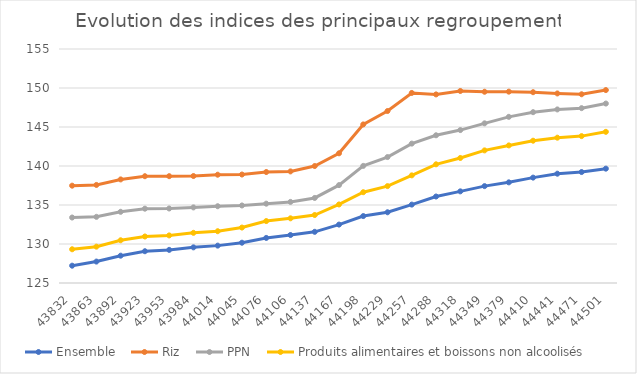
| Category | Ensemble | Riz | PPN | Produits alimentaires et boissons non alcoolisés |
|---|---|---|---|---|
| 43832.0 | 127.22 | 137.477 | 133.394 | 129.324 |
| 43863.0 | 127.747 | 137.571 | 133.482 | 129.658 |
| 43892.0 | 128.503 | 138.279 | 134.127 | 130.477 |
| 43923.0 | 129.073 | 138.691 | 134.528 | 130.962 |
| 43953.0 | 129.246 | 138.695 | 134.553 | 131.1 |
| 43984.0 | 129.569 | 138.715 | 134.691 | 131.433 |
| 44014.0 | 129.792 | 138.884 | 134.842 | 131.639 |
| 44045.0 | 130.165 | 138.908 | 134.939 | 132.108 |
| 44076.0 | 130.779 | 139.227 | 135.17 | 132.94 |
| 44106.0 | 131.152 | 139.307 | 135.396 | 133.293 |
| 44137.0 | 131.562 | 139.996 | 135.904 | 133.717 |
| 44167.0 | 132.488 | 141.627 | 137.548 | 135.07 |
| 44198.0 | 133.582 | 145.33 | 140.014 | 136.64 |
| 44229.0 | 134.068 | 147.047 | 141.147 | 137.422 |
| 44257.0 | 135.051 | 149.367 | 142.872 | 138.8 |
| 44288.0 | 136.088 | 149.178 | 143.938 | 140.217 |
| 44318.0 | 136.75 | 149.619 | 144.606 | 141.028 |
| 44349.0 | 137.421 | 149.519 | 145.469 | 142.002 |
| 44379.0 | 137.905 | 149.532 | 146.302 | 142.639 |
| 44410.0 | 138.51 | 149.461 | 146.899 | 143.242 |
| 44441.0 | 139.014 | 149.302 | 147.252 | 143.631 |
| 44471.0 | 139.227 | 149.196 | 147.416 | 143.832 |
| 44501.0 | 139.66 | 149.736 | 148.006 | 144.381 |